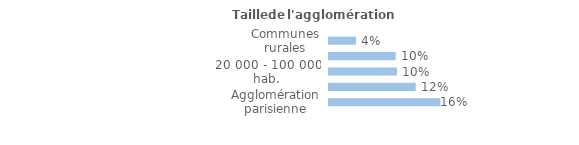
| Category | Series 0 |
|---|---|
| Communes rurales | 0.038 |
| moins de 20 000 hab. | 0.095 |
| 20 000 - 100 000 hab. | 0.097 |
| 100 000 hab. ou plus | 0.124 |
| Agglomération parisienne | 0.159 |